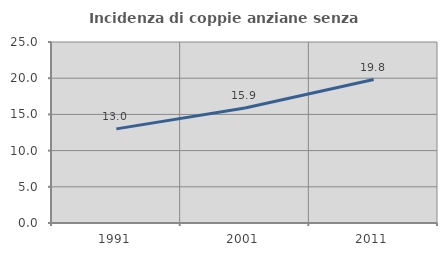
| Category | Incidenza di coppie anziane senza figli  |
|---|---|
| 1991.0 | 13 |
| 2001.0 | 15.888 |
| 2011.0 | 19.82 |